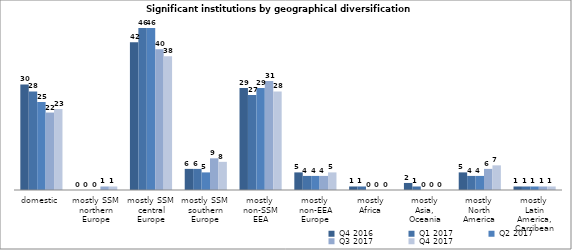
| Category | Q4 2016 | Q1 2017 | Q2 2017 | Q3 2017 | Q4 2017 |
|---|---|---|---|---|---|
| domestic | 30 | 28 | 25 | 22 | 23 |
| mostly SSM 
northern Europe | 0 | 0 | 0 | 1 | 1 |
| mostly SSM 
central Europe | 42 | 46 | 46 | 40 | 38 |
| mostly SSM 
southern Europe | 6 | 6 | 5 | 9 | 8 |
| mostly 
non-SSM EEA | 29 | 27 | 29 | 31 | 28 |
| mostly 
non-EEA Europe | 5 | 4 | 4 | 4 | 5 |
| mostly
Africa | 1 | 1 | 0 | 0 | 0 |
| mostly 
Asia, 
Oceania | 2 | 1 | 0 | 0 | 0 |
| mostly 
North America | 5 | 4 | 4 | 6 | 7 |
| mostly 
Latin America,
Carribean | 1 | 1 | 1 | 1 | 1 |